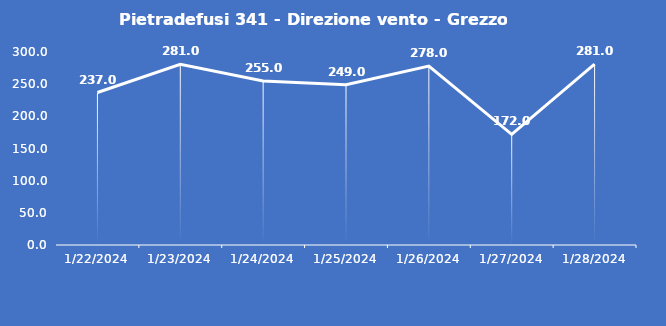
| Category | Pietradefusi 341 - Direzione vento - Grezzo (°N) |
|---|---|
| 1/22/24 | 237 |
| 1/23/24 | 281 |
| 1/24/24 | 255 |
| 1/25/24 | 249 |
| 1/26/24 | 278 |
| 1/27/24 | 172 |
| 1/28/24 | 281 |